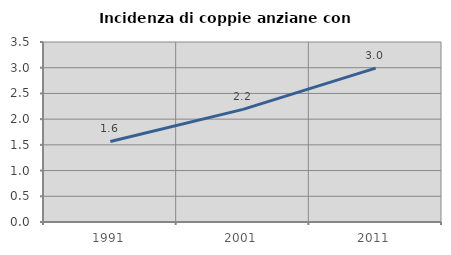
| Category | Incidenza di coppie anziane con figli |
|---|---|
| 1991.0 | 1.566 |
| 2001.0 | 2.191 |
| 2011.0 | 2.991 |